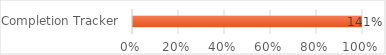
| Category | Series 0 |
|---|---|
| Completion Tracker | 1.412 |